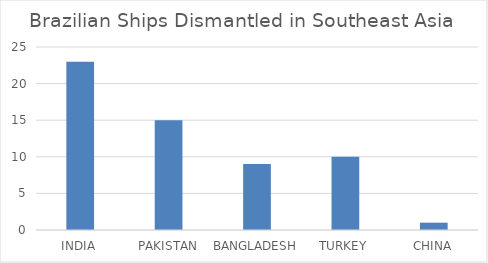
| Category | Nº SHIPS DISMANT. |
|---|---|
| INDIA | 23 |
| PAKISTAN | 15 |
| BANGLADESH | 9 |
| TURKEY | 10 |
| CHINA | 1 |